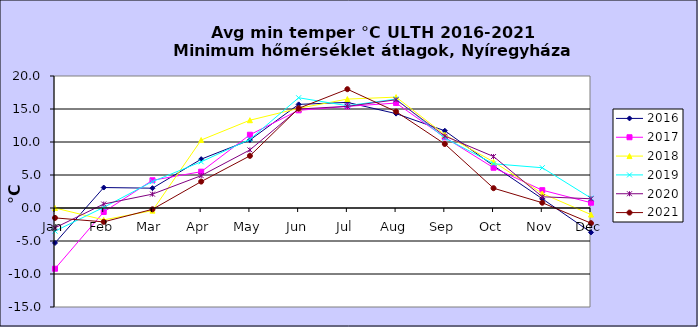
| Category | 2016 | 2017 | 2018 | 2019 | 2020 | 2021 |
|---|---|---|---|---|---|---|
| Jan | -5.3 | -9.2 | 0 | -3.5 | -3 | -1.5 |
| Feb | 3.1 | -0.6 | -1.8 | 0.1 | 0.6 | -2.1 |
| Mar | 3 | 4.2 | -0.4 | 4 | 2.1 | -0.2 |
| Apr | 7.4 | 5.5 | 10.3 | 7 | 4.9 | 4 |
| May | 10.3 | 11.1 | 13.3 | 10.4 | 8.8 | 7.9 |
| Jun | 15.7 | 14.8 | 15.1 | 16.7 | 15 | 15.1 |
| Jul | 16 | 15.4 | 16.5 | 15.5 | 15.4 | 18 |
| Aug | 14.3 | 15.9 | 16.8 | 16.5 | 16.4 | 14.6 |
| Sep | 11.7 | 10.7 | 11.1 | 10.6 | 10.9 | 9.7 |
| Oct | 6.4 | 6.1 | 7 | 6.7 | 7.8 | 3 |
| Nov | 1.4 | 2.7 | 2.2 | 6.1 | 1.7 | 0.8 |
| Dec | -3.7 | 0.8 | -1 | 1.5 | 1.4 | -2.3 |